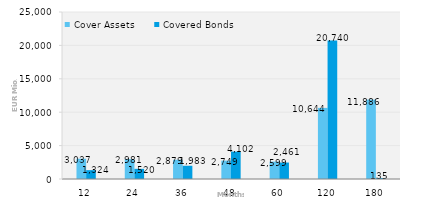
| Category | Cover Assets | Covered Bonds |
|---|---|---|
| 12.0 | 3037.395 | 1324 |
| 24.0 | 2981 | 1520 |
| 36.0 | 2879.205 | 1983 |
| 48.0 | 2748.954 | 4102 |
| 60.0 | 2598.807 | 2461 |
| 120.0 | 10643.6 | 20740 |
| 180.0 | 11886.203 | 135 |